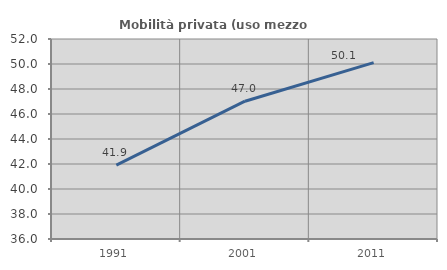
| Category | Mobilità privata (uso mezzo privato) |
|---|---|
| 1991.0 | 41.913 |
| 2001.0 | 47.025 |
| 2011.0 | 50.112 |